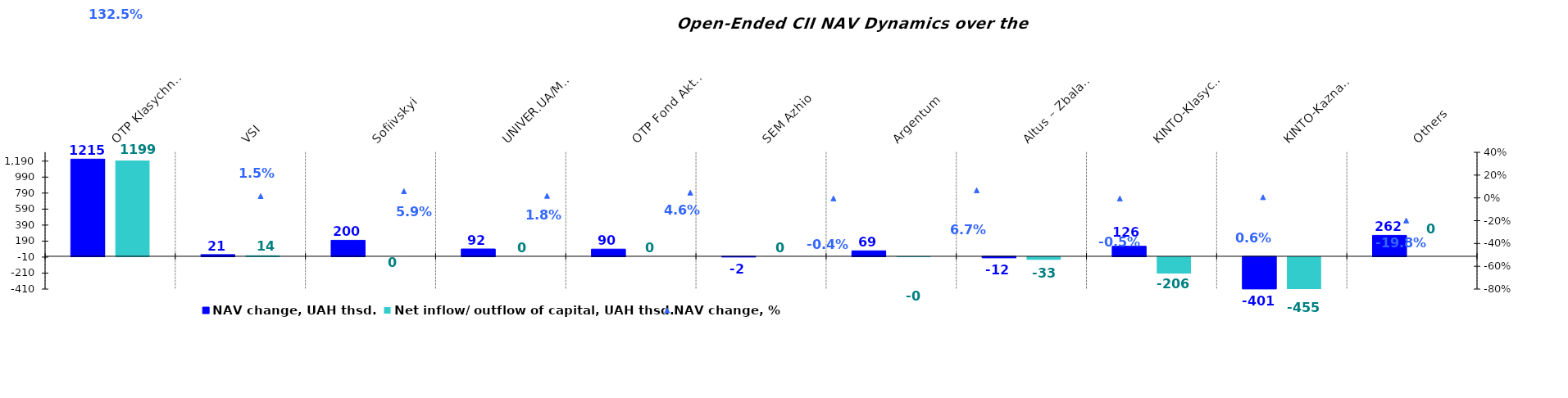
| Category | NAV change, UAH thsd. | Net inflow/ outflow of capital, UAH thsd. |
|---|---|---|
| ОТP Klasychnyi | 1215.129 | 1198.712 |
| VSI | 21.04 | 13.628 |
| Sofiivskyi | 200.344 | 0 |
| UNIVER.UA/Myhailo Hrushevskyi: Fond Derzhavnykh Paperiv    | 91.538 | 0 |
| ОТP Fond Aktsii | 89.954 | 0 |
| SEM Azhio | -1.861 | 0 |
| Аrgentum | 68.671 | -0.27 |
| Altus – Zbalansovanyi | -12.207 | -32.864 |
| KINTO-Klasychnyi | 125.733 | -205.808 |
| KINTO-Kaznacheyskyi | -401.252 | -454.675 |
| Others | 261.519 | 0 |